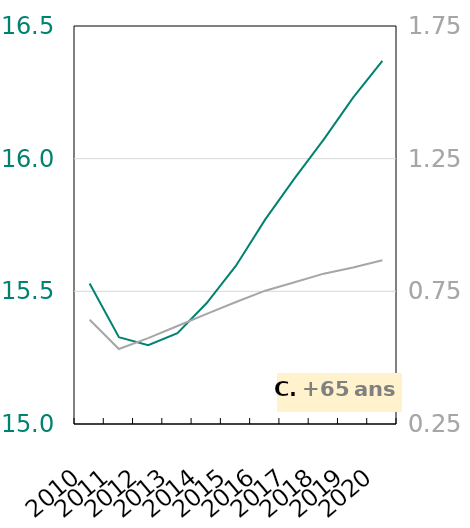
| Category | Allemande |
|---|---|
| 2010 | 15.53 |
| 2011 | 15.327 |
| 2012 | 15.297 |
| 2013 | 15.342 |
| 2014 | 15.456 |
| 2015 | 15.597 |
| 2016 | 15.771 |
| 2017 | 15.926 |
| 2018 | 16.073 |
| 2019 | 16.23 |
| 2020 | 16.369 |